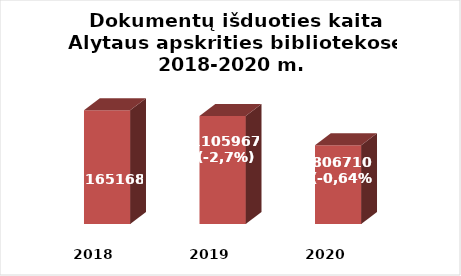
| Category | Series 0 |
|---|---|
| 2018.0 | 1165168 |
| 2019.0 | 1105967 |
| 2020.0 | 806710 |